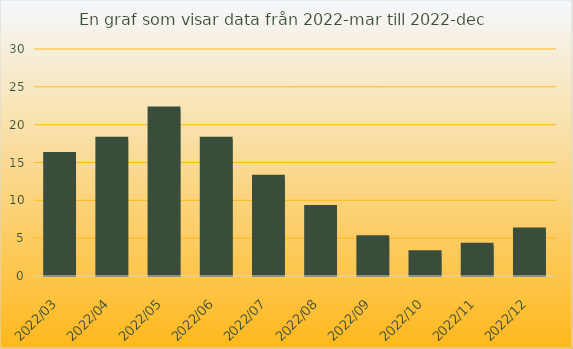
| Category | Series 0 |
|---|---|
| 2022-03-01 | 16 |
| 2022-04-01 | 18 |
| 2022-05-01 | 22 |
| 2022-06-01 | 18 |
| 2022-07-01 | 13 |
| 2022-08-01 | 9 |
| 2022-09-01 | 5 |
| 2022-10-01 | 3 |
| 2022-11-01 | 4 |
| 2022-12-01 | 6 |